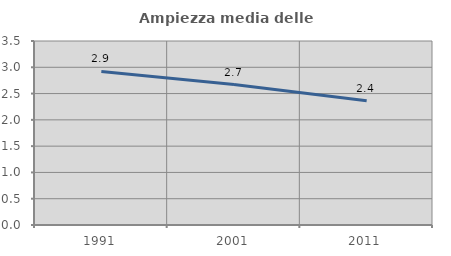
| Category | Ampiezza media delle famiglie |
|---|---|
| 1991.0 | 2.921 |
| 2001.0 | 2.671 |
| 2011.0 | 2.365 |